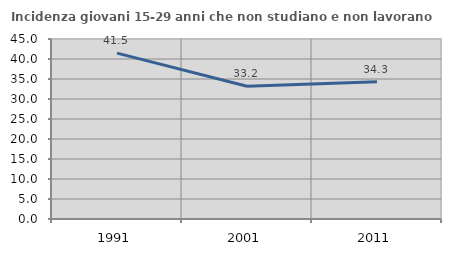
| Category | Incidenza giovani 15-29 anni che non studiano e non lavorano  |
|---|---|
| 1991.0 | 41.475 |
| 2001.0 | 33.191 |
| 2011.0 | 34.32 |